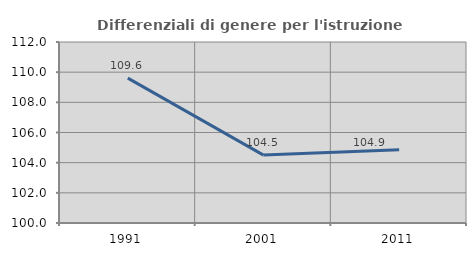
| Category | Differenziali di genere per l'istruzione superiore |
|---|---|
| 1991.0 | 109.604 |
| 2001.0 | 104.503 |
| 2011.0 | 104.862 |